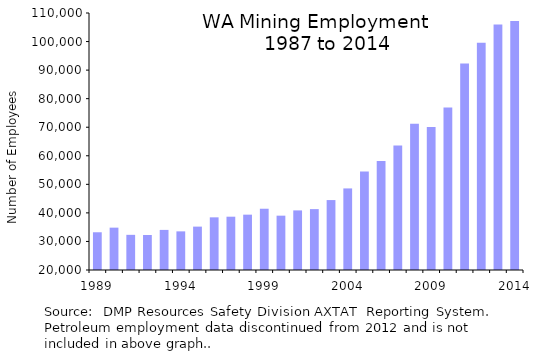
| Category | Series 0 |
|---|---|
| 1989.0 | 33216 |
| 1990.0 | 34832 |
| 1991.0 | 32315 |
| 1992.0 | 32254 |
| 1993.0 | 34043 |
| 1994.0 | 33529 |
| 1995.0 | 35191 |
| 1996.0 | 38442 |
| 1997.0 | 38665 |
| 1998.0 | 39379 |
| 1999.0 | 41453 |
| 2000.0 | 39028 |
| 2001.0 | 40870 |
| 2002.0 | 41322 |
| 2003.0 | 44491 |
| 2004.0 | 48569 |
| 2005.0 | 54489 |
| 2006.0 | 58201 |
| 2007.0 | 63608 |
| 2008.0 | 71225 |
| 2009.0 | 70063 |
| 2010.0 | 76921 |
| 2011.0 | 92341 |
| 2012.0 | 99551 |
| 2013.0 | 105974 |
| 2014.0 | 107213 |